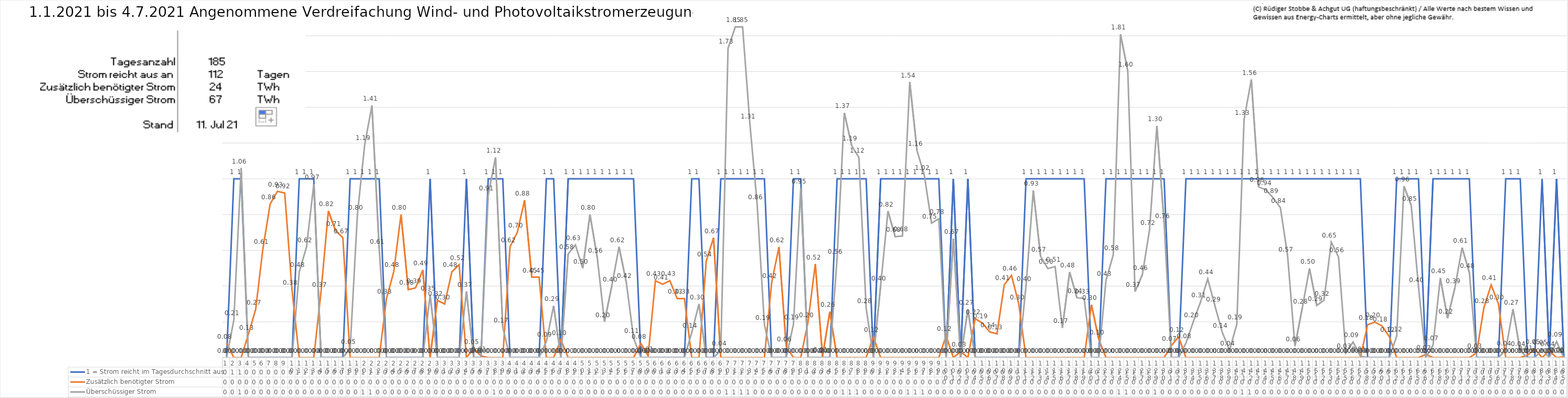
| Category | 1 = Strom reicht im Tagesdurchschnitt aus | Zusätzlich benötigter Strom | Überschüssiger Strom |
|---|---|---|---|
| 0 | 0 | 0.08 | 0 |
| 1 | 1 | 0 | 0.21 |
| 2 | 1 | 0 | 1.06 |
| 3 | 0 | 0.13 | 0 |
| 4 | 0 | 0.27 | 0 |
| 5 | 0 | 0.61 | 0 |
| 6 | 0 | 0.86 | 0 |
| 7 | 0 | 0.93 | 0 |
| 8 | 0 | 0.92 | 0 |
| 9 | 0 | 0.38 | 0 |
| 10 | 1 | 0 | 0.48 |
| 11 | 1 | 0 | 0.62 |
| 12 | 1 | 0 | 0.97 |
| 13 | 0 | 0.37 | 0 |
| 14 | 0 | 0.82 | 0 |
| 15 | 0 | 0.71 | 0 |
| 16 | 0 | 0.67 | 0 |
| 17 | 1 | 0 | 0.05 |
| 18 | 1 | 0 | 0.8 |
| 19 | 1 | 0 | 1.19 |
| 20 | 1 | 0 | 1.41 |
| 21 | 1 | 0 | 0.61 |
| 22 | 0 | 0.33 | 0 |
| 23 | 0 | 0.48 | 0 |
| 24 | 0 | 0.8 | 0 |
| 25 | 0 | 0.38 | 0 |
| 26 | 0 | 0.39 | 0 |
| 27 | 0 | 0.49 | 0 |
| 28 | 1 | 0 | 0.35 |
| 29 | 0 | 0.32 | 0 |
| 30 | 0 | 0.3 | 0 |
| 31 | 0 | 0.48 | 0 |
| 32 | 0 | 0.52 | 0 |
| 33 | 1 | 0 | 0.37 |
| 34 | 0 | 0.05 | 0 |
| 35 | 0 | 0.01 | 0 |
| 36 | 1 | 0 | 0.91 |
| 37 | 1 | 0 | 1.12 |
| 38 | 1 | 0 | 0.17 |
| 39 | 0 | 0.62 | 0 |
| 40 | 0 | 0.7 | 0 |
| 41 | 0 | 0.88 | 0 |
| 42 | 0 | 0.45 | 0 |
| 43 | 0 | 0.45 | 0 |
| 44 | 1 | 0 | 0.09 |
| 45 | 1 | 0 | 0.29 |
| 46 | 0 | 0.1 | 0 |
| 47 | 1 | 0 | 0.58 |
| 48 | 1 | 0 | 0.63 |
| 49 | 1 | 0 | 0.5 |
| 50 | 1 | 0 | 0.8 |
| 51 | 1 | 0 | 0.56 |
| 52 | 1 | 0 | 0.2 |
| 53 | 1 | 0 | 0.4 |
| 54 | 1 | 0 | 0.62 |
| 55 | 1 | 0 | 0.42 |
| 56 | 1 | 0 | 0.11 |
| 57 | 0 | 0.08 | 0 |
| 58 | 0 | 0.01 | 0 |
| 59 | 0 | 0.43 | 0 |
| 60 | 0 | 0.41 | 0 |
| 61 | 0 | 0.43 | 0 |
| 62 | 0 | 0.33 | 0 |
| 63 | 0 | 0.33 | 0 |
| 64 | 1 | 0 | 0.14 |
| 65 | 1 | 0 | 0.3 |
| 66 | 0 | 0.54 | 0 |
| 67 | 0 | 0.67 | 0 |
| 68 | 1 | 0 | 0.04 |
| 69 | 1 | 0 | 1.73 |
| 70 | 1 | 0 | 1.85 |
| 71 | 1 | 0 | 1.85 |
| 72 | 1 | 0 | 1.31 |
| 73 | 1 | 0 | 0.861 |
| 74 | 1 | 0 | 0.185 |
| 75 | 0 | 0.42 | 0 |
| 76 | 0 | 0.619 | 0 |
| 77 | 0 | 0.064 | 0 |
| 78 | 1 | 0 | 0.187 |
| 79 | 1 | 0 | 0.946 |
| 80 | 0 | 0.198 | 0 |
| 81 | 0 | 0.523 | 0 |
| 82 | 0 | 0.007 | 0 |
| 83 | 0 | 0.257 | 0 |
| 84 | 1 | 0 | 0.555 |
| 85 | 1 | 0 | 1.369 |
| 86 | 1 | 0 | 1.186 |
| 87 | 1 | 0 | 1.12 |
| 88 | 1 | 0 | 0.278 |
| 89 | 0 | 0.117 | 0 |
| 90 | 1 | 0 | 0.403 |
| 91 | 1 | 0 | 0.819 |
| 92 | 1 | 0 | 0.676 |
| 93 | 1 | 0 | 0.681 |
| 94 | 1 | 0 | 1.541 |
| 95 | 1 | 0 | 1.158 |
| 96 | 1 | 0 | 1.022 |
| 97 | 1 | 0 | 0.752 |
| 98 | 1 | 0 | 0.776 |
| 99 | 0 | 0.123 | 0 |
| 100 | 1 | 0 | 0.665 |
| 101 | 0 | 0.034 | 0 |
| 102 | 1 | 0 | 0.269 |
| 103 | 0 | 0.218 | 0 |
| 104 | 0 | 0.193 | 0 |
| 105 | 0 | 0.144 | 0 |
| 106 | 0 | 0.133 | 0 |
| 107 | 0 | 0.407 | 0 |
| 108 | 0 | 0.46 | 0 |
| 109 | 0 | 0.3 | 0 |
| 110 | 1 | 0 | 0.402 |
| 111 | 1 | 0 | 0.934 |
| 112 | 1 | 0 | 0.567 |
| 113 | 1 | 0 | 0.498 |
| 114 | 1 | 0 | 0.509 |
| 115 | 1 | 0 | 0.167 |
| 116 | 1 | 0 | 0.478 |
| 117 | 1 | 0 | 0.336 |
| 118 | 1 | 0 | 0.331 |
| 119 | 0 | 0.296 | 0 |
| 120 | 0 | 0.103 | 0 |
| 121 | 1 | 0 | 0.432 |
| 122 | 1 | 0 | 0.575 |
| 123 | 1 | 0 | 1.808 |
| 124 | 1 | 0 | 1.602 |
| 125 | 1 | 0 | 0.369 |
| 126 | 1 | 0 | 0.463 |
| 127 | 1 | 0 | 0.716 |
| 128 | 1 | 0 | 1.296 |
| 129 | 1 | 0 | 0.755 |
| 130 | 0 | 0.067 | 0 |
| 131 | 0 | 0.117 | 0 |
| 132 | 1 | 0 | 0.081 |
| 133 | 1 | 0 | 0.2 |
| 134 | 1 | 0 | 0.31 |
| 135 | 1 | 0 | 0.44 |
| 136 | 1 | 0 | 0.289 |
| 137 | 1 | 0 | 0.142 |
| 138 | 1 | 0 | 0.041 |
| 139 | 1 | 0 | 0.186 |
| 140 | 1 | 0 | 1.332 |
| 141 | 1 | 0 | 1.555 |
| 142 | 1 | 0 | 0.955 |
| 143 | 1 | 0 | 0.938 |
| 144 | 1 | 0 | 0.894 |
| 145 | 1 | 0 | 0.838 |
| 146 | 1 | 0 | 0.567 |
| 147 | 1 | 0 | 0.064 |
| 148 | 1 | 0 | 0.276 |
| 149 | 1 | 0 | 0.498 |
| 150 | 1 | 0 | 0.292 |
| 151 | 1 | 0 | 0.321 |
| 152 | 1 | 0 | 0.646 |
| 153 | 1 | 0 | 0.563 |
| 154 | 1 | 0 | 0.026 |
| 155 | 1 | 0 | 0.087 |
| 156 | 1 | 0 | 0.009 |
| 157 | 0 | 0.184 | 0 |
| 158 | 0 | 0.199 | 0 |
| 159 | 0 | 0.177 | 0 |
| 160 | 0 | 0.116 | 0 |
| 161 | 1 | 0 | 0.12 |
| 162 | 1 | 0 | 0.959 |
| 163 | 1 | 0 | 0.851 |
| 164 | 1 | 0 | 0.397 |
| 165 | 0 | 0.017 | 0 |
| 166 | 1 | 0 | 0.069 |
| 167 | 1 | 0 | 0.445 |
| 168 | 1 | 0 | 0.221 |
| 169 | 1 | 0 | 0.389 |
| 170 | 1 | 0 | 0.615 |
| 171 | 1 | 0 | 0.476 |
| 172 | 0 | 0.027 | 0 |
| 173 | 0 | 0.28 | 0 |
| 174 | 0 | 0.406 | 0 |
| 175 | 0 | 0.3 | 0 |
| 176 | 1 | 0 | 0.042 |
| 177 | 1 | 0 | 0.271 |
| 178 | 1 | 0 | 0.038 |
| 179 | 0 | 0.014 | 0 |
| 180 | 0 | 0.049 | 0 |
| 181 | 1 | 0 | 0.046 |
| 182 | 0 | 0.038 | 0 |
| 183 | 1 | 0 | 0.09 |
| 184 | 0 | 0.005 | 0 |